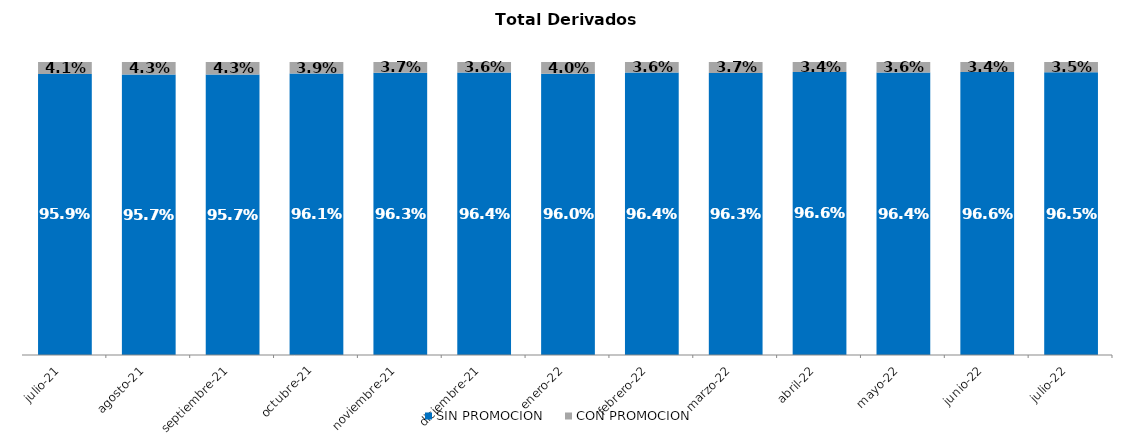
| Category | SIN PROMOCION   | CON PROMOCION   |
|---|---|---|
| 2021-07-01 | 0.959 | 0.041 |
| 2021-08-01 | 0.957 | 0.043 |
| 2021-09-01 | 0.957 | 0.043 |
| 2021-10-01 | 0.961 | 0.039 |
| 2021-11-01 | 0.963 | 0.037 |
| 2021-12-01 | 0.964 | 0.036 |
| 2022-01-01 | 0.96 | 0.04 |
| 2022-02-01 | 0.964 | 0.036 |
| 2022-03-01 | 0.963 | 0.037 |
| 2022-04-01 | 0.966 | 0.034 |
| 2022-05-01 | 0.964 | 0.036 |
| 2022-06-01 | 0.966 | 0.034 |
| 2022-07-01 | 0.965 | 0.035 |